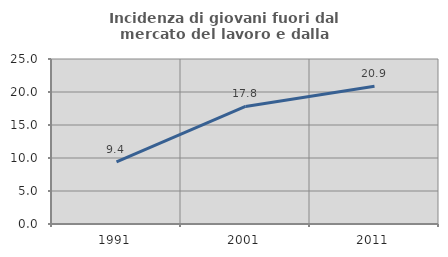
| Category | Incidenza di giovani fuori dal mercato del lavoro e dalla formazione  |
|---|---|
| 1991.0 | 9.426 |
| 2001.0 | 17.816 |
| 2011.0 | 20.863 |